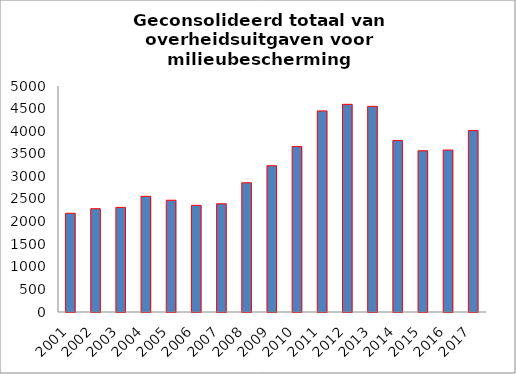
| Category | Geconsolideerd totaal (a) |
|---|---|
| 2001.0 | 2183.7 |
| 2002.0 | 2284.9 |
| 2003.0 | 2314.4 |
| 2004.0 | 2559.3 |
| 2005.0 | 2472.7 |
| 2006.0 | 2358.4 |
| 2007.0 | 2393.8 |
| 2008.0 | 2858.3 |
| 2009.0 | 3234.6 |
| 2010.0 | 3660.8 |
| 2011.0 | 4448.4 |
| 2012.0 | 4594.2 |
| 2013.0 | 4549.9 |
| 2014.0 | 3792.9 |
| 2015.0 | 3566.5 |
| 2016.0 | 3583.3 |
| 2017.0 | 4014.3 |